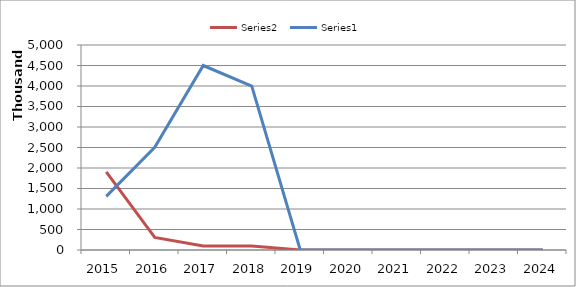
| Category | Series 1 | Series 0 |
|---|---|---|
| 2015.0 | 1905618 | 1307975 |
| 2016.0 | 305448 | 2506683 |
| 2017.0 | 100000 | 4500000 |
| 2018.0 | 100000 | 4000000 |
| 2019.0 | 0 | 0 |
| 2020.0 | 0 | 0 |
| 2021.0 | 0 | 0 |
| 2022.0 | 0 | 0 |
| 2023.0 | 0 | 0 |
| 2024.0 | 0 | 0 |